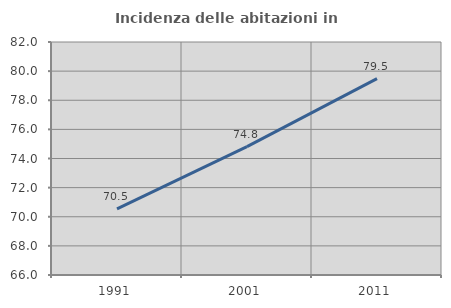
| Category | Incidenza delle abitazioni in proprietà  |
|---|---|
| 1991.0 | 70.546 |
| 2001.0 | 74.817 |
| 2011.0 | 79.487 |